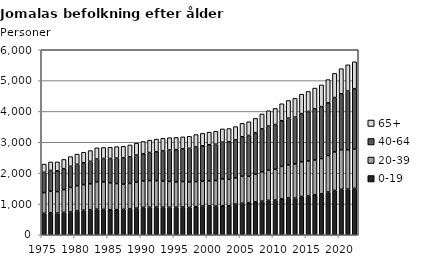
| Category | 0-19 | 20-39 | 40-64 | 65+ |
|---|---|---|---|---|
| 1975.0 | 697 | 670 | 658 | 267 |
| 1976.0 | 712 | 701 | 673 | 275 |
| 1977.0 | 700 | 700 | 675 | 288 |
| 1978.0 | 727 | 739 | 678 | 300 |
| 1979.0 | 739 | 794 | 688 | 313 |
| 1980.0 | 773 | 819 | 694 | 329 |
| 1981.0 | 792 | 835 | 709 | 340 |
| 1982.0 | 806 | 848 | 727 | 349 |
| 1983.0 | 830 | 886 | 740 | 363 |
| 1984.0 | 823 | 890 | 761 | 357 |
| 1985.0 | 812 | 872 | 788 | 367 |
| 1986.0 | 814 | 848 | 823 | 373 |
| 1987.0 | 824 | 816 | 853 | 376 |
| 1988.0 | 838 | 827 | 860 | 387 |
| 1989.0 | 863 | 847 | 874 | 387 |
| 1990.0 | 888 | 859 | 881 | 397 |
| 1991.0 | 890 | 867 | 911 | 401 |
| 1992.0 | 896 | 860 | 938 | 408 |
| 1993.0 | 894 | 845 | 980 | 410 |
| 1994.0 | 890 | 839 | 1020 | 401 |
| 1995.0 | 890 | 823 | 1048 | 395 |
| 1996.0 | 900 | 827 | 1059 | 389 |
| 1997.0 | 886 | 830 | 1086 | 393 |
| 1998.0 | 910 | 814 | 1124 | 402 |
| 1999.0 | 933 | 804 | 1149 | 402 |
| 2000.0 | 937 | 812 | 1170 | 409 |
| 2001.0 | 930 | 828 | 1179 | 419 |
| 2002.0 | 942 | 872 | 1190 | 429 |
| 2003.0 | 939 | 859 | 1216 | 430 |
| 2004.0 | 995 | 852 | 1230 | 431 |
| 2005.0 | 1024 | 874 | 1279 | 437 |
| 2006.0 | 1040 | 856 | 1323 | 445 |
| 2007.0 | 1070 | 892 | 1348 | 464 |
| 2008.0 | 1090 | 952 | 1392 | 483 |
| 2009.0 | 1116 | 978 | 1433 | 495 |
| 2010.0 | 1125 | 1000 | 1450 | 523 |
| 2011.0 | 1167 | 1052 | 1479 | 551 |
| 2012.0 | 1193 | 1075 | 1514 | 573 |
| 2013.0 | 1188 | 1109 | 1519 | 608 |
| 2014.0 | 1241 | 1124 | 1564 | 631 |
| 2015.0 | 1258 | 1136 | 1604 | 650 |
| 2016.0 | 1300 | 1123 | 1661 | 673 |
| 2017.0 | 1327 | 1144 | 1686 | 702 |
| 2018.0 | 1386 | 1183 | 1712 | 751 |
| 2019.0 | 1439 | 1247 | 1764 | 783 |
| 2020.0 | 1476 | 1283 | 1811 | 816 |
| 2021.0 | 1480 | 1276 | 1904 | 852 |
| 2022.0 | 1506 | 1276 | 1955 | 873 |